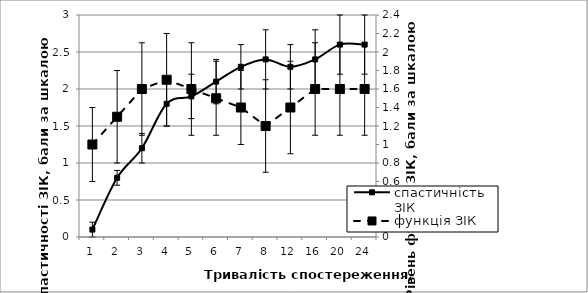
| Category | спастичність ЗІК |
|---|---|
| 1.0 | 0.1 |
| 2.0 | 0.8 |
| 3.0 | 1.2 |
| 4.0 | 1.8 |
| 5.0 | 1.9 |
| 6.0 | 2.1 |
| 7.0 | 2.3 |
| 8.0 | 2.4 |
| 12.0 | 2.3 |
| 16.0 | 2.4 |
| 20.0 | 2.6 |
| 24.0 | 2.6 |